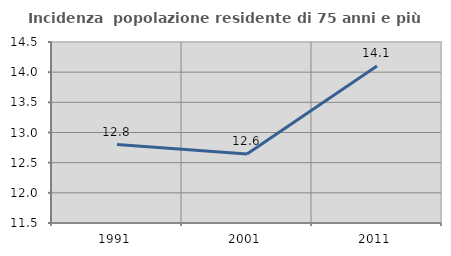
| Category | Incidenza  popolazione residente di 75 anni e più |
|---|---|
| 1991.0 | 12.8 |
| 2001.0 | 12.644 |
| 2011.0 | 14.103 |